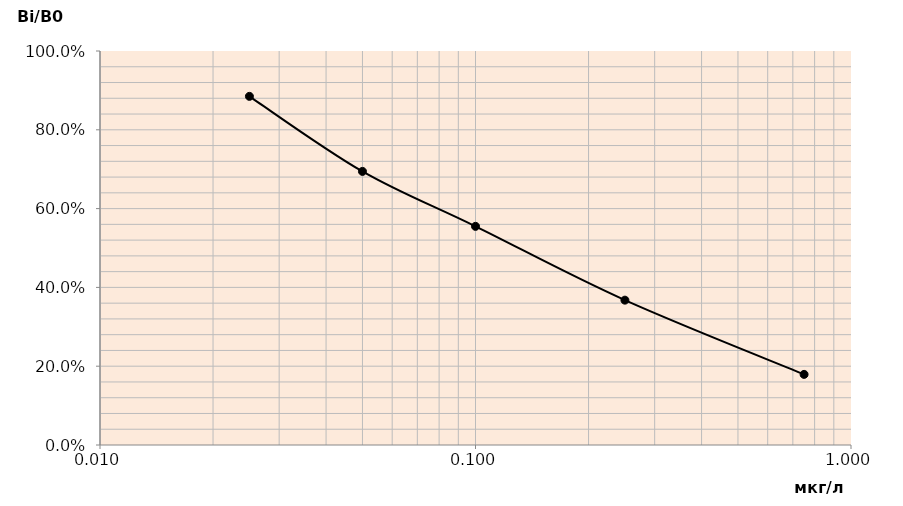
| Category | Series 0 |
|---|---|
| 0.025 | 0.885 |
| 0.05 | 0.694 |
| 0.1 | 0.555 |
| 0.25 | 0.368 |
| 0.75 | 0.179 |